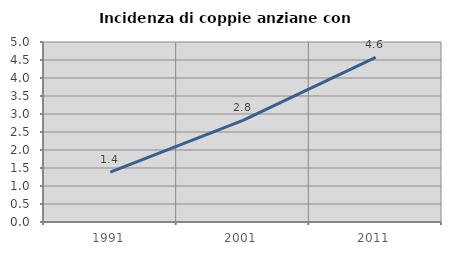
| Category | Incidenza di coppie anziane con figli |
|---|---|
| 1991.0 | 1.386 |
| 2001.0 | 2.824 |
| 2011.0 | 4.571 |